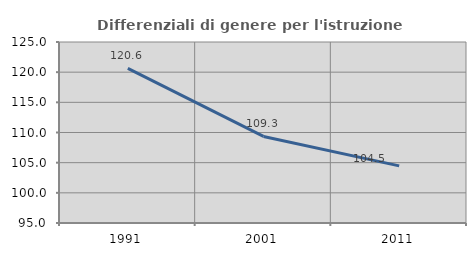
| Category | Differenziali di genere per l'istruzione superiore |
|---|---|
| 1991.0 | 120.625 |
| 2001.0 | 109.343 |
| 2011.0 | 104.466 |